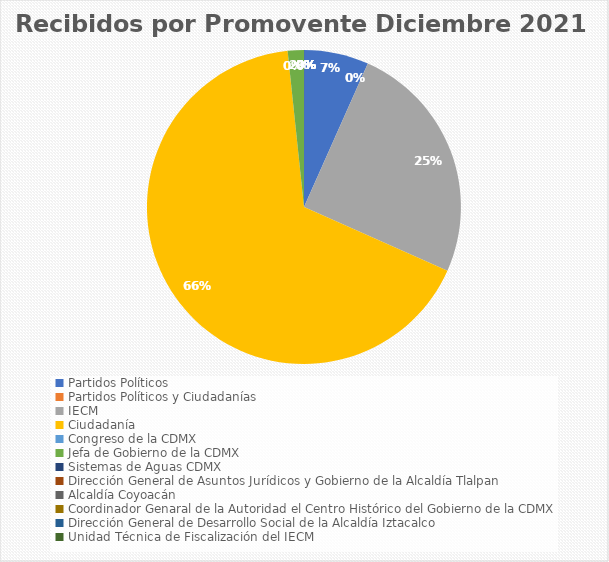
| Category | Recibidos por Promovente Diciembre |
|---|---|
| Partidos Políticos | 4 |
| Partidos Políticos y Ciudadanías | 0 |
| IECM | 15 |
| Ciudadanía  | 40 |
| Congreso de la CDMX | 0 |
| Jefa de Gobierno de la CDMX | 1 |
| Sistemas de Aguas CDMX | 0 |
| Dirección General de Asuntos Jurídicos y Gobierno de la Alcaldía Tlalpan | 0 |
| Alcaldía Coyoacán | 0 |
| Coordinador Genaral de la Autoridad el Centro Histórico del Gobierno de la CDMX | 0 |
| Dirección General de Desarrollo Social de la Alcaldía Iztacalco | 0 |
| Unidad Técnica de Fiscalización del IECM | 0 |